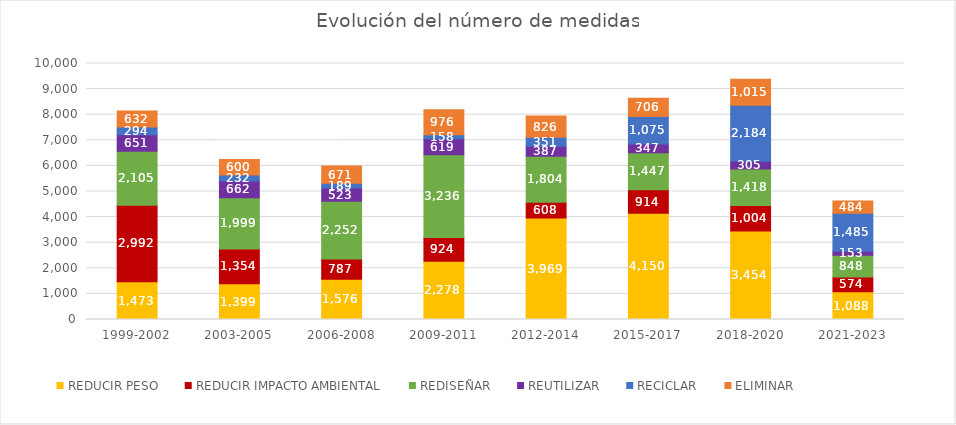
| Category | REDUCIR PESO | REDUCIR IMPACTO AMBIENTAL | REDISEÑAR | REUTILIZAR | RECICLAR | ELIMINAR |
|---|---|---|---|---|---|---|
| 1999-2002 | 1473 | 2992 | 2105 | 651 | 294 | 632 |
| 2003-2005 | 1399 | 1354 | 1999 | 662 | 232 | 600 |
| 2006-2008 | 1576 | 787 | 2252 | 523 | 189 | 671 |
| 2009-2011 | 2278 | 924 | 3236 | 619 | 158 | 976 |
| 2012-2014 | 3969 | 608 | 1804 | 387 | 351 | 826 |
| 2015-2017 | 4150 | 914 | 1447 | 347 | 1075 | 706 |
| 2018-2020 | 3454 | 1004 | 1418 | 305 | 2184 | 1015 |
| 2021-2023 | 1088 | 574 | 848 | 153 | 1485 | 484 |